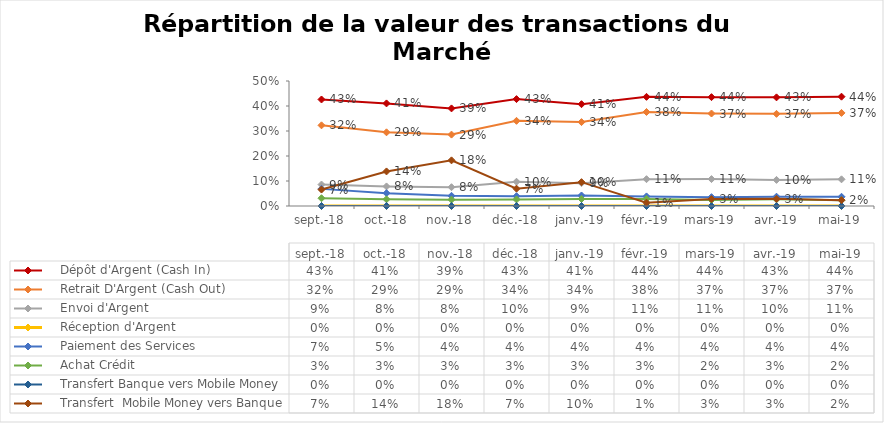
| Category |     Dépôt d'Argent (Cash In) |     Retrait D'Argent (Cash Out)  |     Envoi d'Argent  |     Réception d'Argent |     Paiement des Services |     Achat Crédit |     Transfert Banque vers Mobile Money |     Transfert  Mobile Money vers Banque  |
|---|---|---|---|---|---|---|---|---|
| 2018-09-01 | 0.426 | 0.323 | 0.086 | 0 | 0.068 | 0.031 | 0 | 0.066 |
| 2018-10-01 | 0.41 | 0.295 | 0.078 | 0 | 0.051 | 0.027 | 0 | 0.138 |
| 2018-11-01 | 0.39 | 0.286 | 0.075 | 0 | 0.041 | 0.025 | 0 | 0.183 |
| 2018-12-01 | 0.428 | 0.341 | 0.097 | 0 | 0.039 | 0.026 | 0 | 0.069 |
| 2019-01-01 | 0.407 | 0.336 | 0.091 | 0 | 0.042 | 0.028 | 0 | 0.095 |
| 2019-02-01 | 0.437 | 0.376 | 0.107 | 0 | 0.038 | 0.028 | 0 | 0.013 |
| 2019-03-01 | 0.435 | 0.37 | 0.108 | 0 | 0.035 | 0.024 | 0 | 0.028 |
| 2019-04-01 | 0.435 | 0.369 | 0.104 | 0 | 0.037 | 0.027 | 0 | 0.029 |
| 2019-05-01 | 0.437 | 0.372 | 0.107 | 0 | 0.037 | 0.023 | 0 | 0.023 |